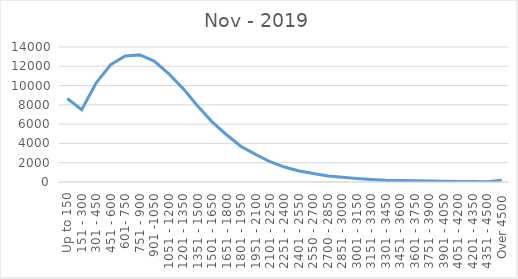
| Category | Nov - 2019 |
|---|---|
| Up to 150 | 8655 |
| 151 - 300 | 7493 |
| 301 - 450 | 10287 |
| 451 - 600 | 12158 |
| 601- 750 | 13060 |
| 751 - 900 | 13181 |
| 901 -1050 | 12544 |
| 1051 - 1200 | 11247 |
| 1201 - 1350 | 9687 |
| 1351 - 1500 | 7893 |
| 1501 - 1650 | 6242 |
| 1651 - 1800 | 4900 |
| 1801 - 1950 | 3678 |
| 1951 - 2100 | 2865 |
| 2101 - 2250 | 2101 |
| 2251 - 2400 | 1548 |
| 2401 - 2550 | 1150 |
| 2550 - 2700 | 882 |
| 2700 - 2850 | 617 |
| 2851 - 3000 | 490 |
| 3001 - 3150 | 370 |
| 3151 - 3300 | 260 |
| 3301 - 3450 | 183 |
| 3451 - 3600 | 161 |
| 3601 - 3750 | 128 |
| 3751 - 3900 | 95 |
| 3901 - 4050 | 74 |
| 4051 - 4200 | 46 |
| 4201 - 4350 | 52 |
| 4351 - 4500 | 37 |
| Over 4500 | 186 |